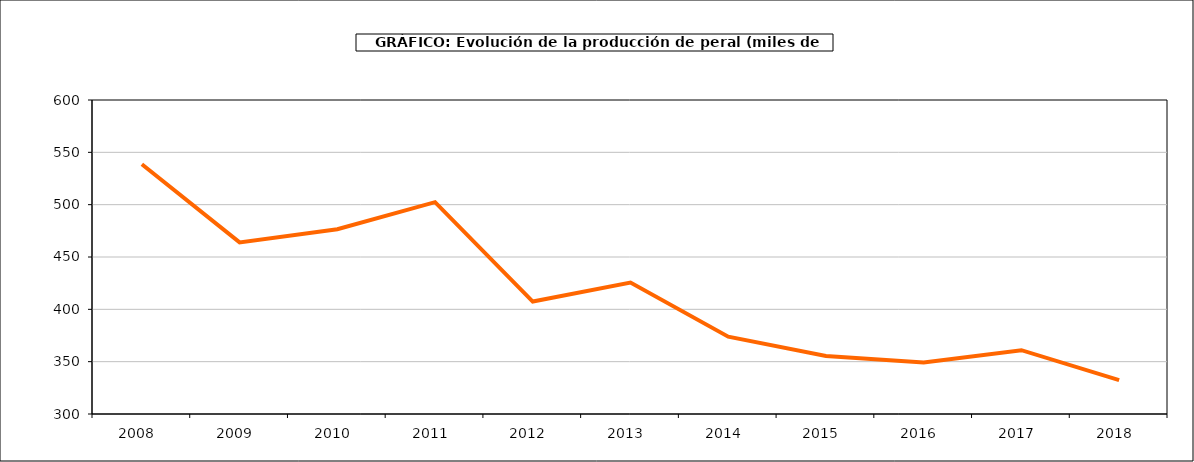
| Category | producción peral |
|---|---|
| 2008.0 | 538.675 |
| 2009.0 | 463.969 |
| 2010.0 | 476.586 |
| 2011.0 | 502.434 |
| 2012.0 | 407.428 |
| 2013.0 | 425.56 |
| 2014.0 | 373.865 |
| 2015.0 | 355.41 |
| 2016.0 | 349.247 |
| 2017.0 | 360.957 |
| 2018.0 | 332.319 |